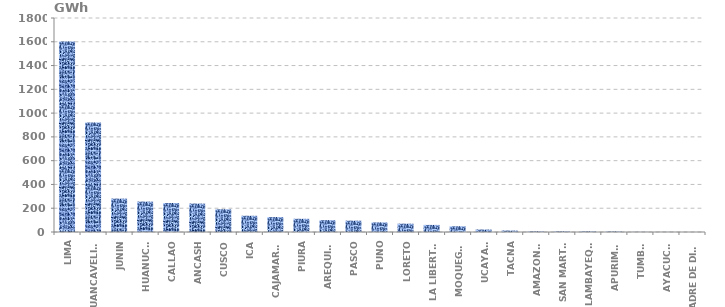
| Category | Series 0 |
|---|---|
| LIMA | 1602.642 |
| HUANCAVELICA | 921.1 |
| JUNIN | 280.871 |
| HUANUCO | 255.789 |
| CALLAO | 243.84 |
| ANCASH | 239.119 |
| CUSCO | 191.16 |
| ICA | 136.578 |
| CAJAMARCA | 125.648 |
| PIURA | 111.081 |
| AREQUIPA | 99.616 |
| PASCO | 95.416 |
| PUNO | 80.595 |
| LORETO | 69.985 |
| LA LIBERTAD | 59.591 |
| MOQUEGUA | 48.209 |
| UCAYALI | 20.806 |
| TACNA | 12.202 |
| AMAZONAS | 5.341 |
| SAN MARTÍN | 5.122 |
| LAMBAYEQUE | 5.063 |
| APURIMAC | 4.305 |
| TUMBES | 1.082 |
| AYACUCHO | 0.722 |
| MADRE DE DIOS | 0.141 |